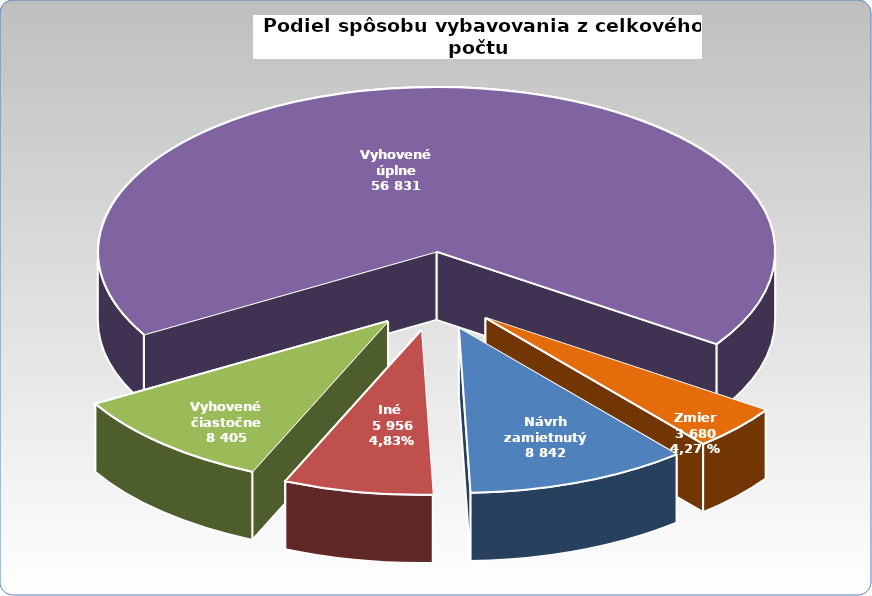
| Category | Series 0 | Series 1 |
|---|---|---|
| návrh zamietnutý | 8842 |  |
| iné | 5956 |  |
| vyhovené čiastočne | 8405 |  |
| vyhovené úplne | 56831 |  |
| zmier | 3680 |  |